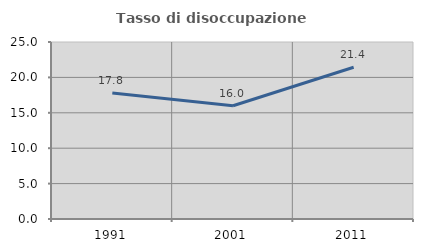
| Category | Tasso di disoccupazione giovanile  |
|---|---|
| 1991.0 | 17.81 |
| 2001.0 | 16 |
| 2011.0 | 21.429 |